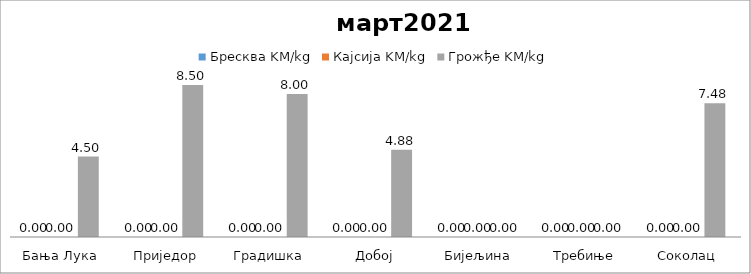
| Category | Бресква KM/kg | Кајсија KM/kg | Грожђе KM/kg |
|---|---|---|---|
| Бања Лука | 0 | 0 | 4.5 |
| Приједор | 0 | 0 | 8.5 |
| Градишка | 0 | 0 | 8 |
| Добој | 0 | 0 | 4.875 |
| Бијељина | 0 | 0 | 0 |
|  Требиње | 0 | 0 | 0 |
| Соколац | 0 | 0 | 7.475 |